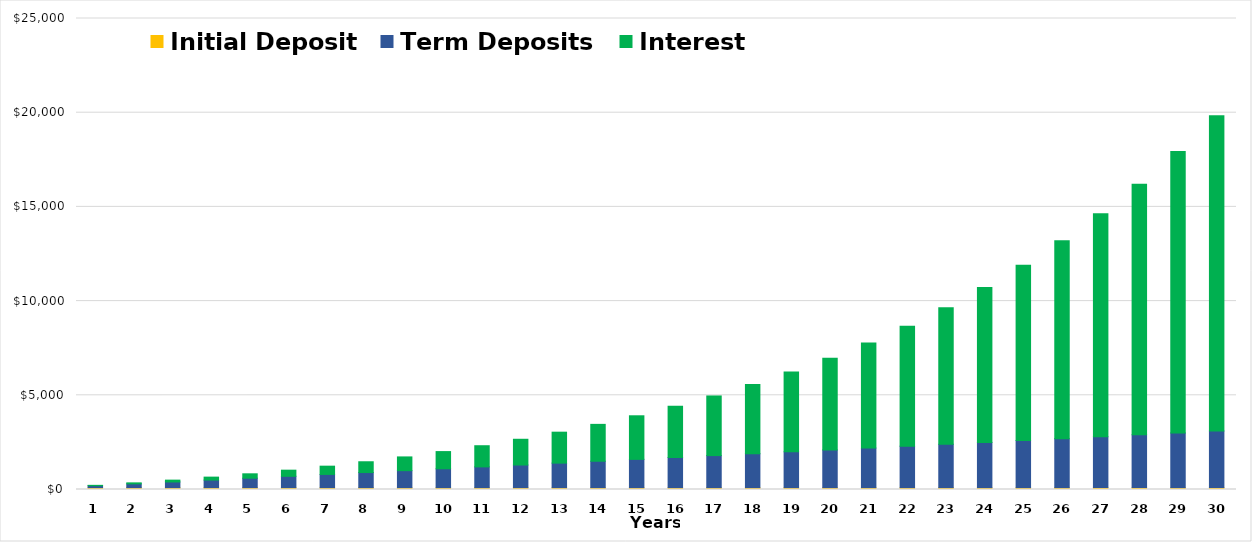
| Category | Initial Deposit | Term Deposits | Interest |
|---|---|---|---|
| 0 | 100 | 100 | 20 |
| 1 | 100 | 200 | 52 |
| 2 | 100 | 300 | 97.2 |
| 3 | 100 | 400 | 156.92 |
| 4 | 100 | 500 | 232.612 |
| 5 | 100 | 600 | 325.873 |
| 6 | 100 | 700 | 438.461 |
| 7 | 100 | 800 | 572.307 |
| 8 | 100 | 900 | 729.537 |
| 9 | 100 | 1000 | 912.491 |
| 10 | 100 | 1100 | 1123.74 |
| 11 | 100 | 1200 | 1366.114 |
| 12 | 100 | 1300 | 1642.725 |
| 13 | 100 | 1400 | 1956.998 |
| 14 | 100 | 1500 | 2312.698 |
| 15 | 100 | 1600 | 2713.968 |
| 16 | 100 | 1700 | 3165.364 |
| 17 | 100 | 1800 | 3671.901 |
| 18 | 100 | 1900 | 4239.091 |
| 19 | 100 | 2000 | 4873 |
| 20 | 100 | 2100 | 5580.3 |
| 21 | 100 | 2200 | 6368.33 |
| 22 | 100 | 2300 | 7245.163 |
| 23 | 100 | 2400 | 8219.679 |
| 24 | 100 | 2500 | 9301.647 |
| 25 | 100 | 2600 | 10501.812 |
| 26 | 100 | 2700 | 11831.993 |
| 27 | 100 | 2800 | 13305.192 |
| 28 | 100 | 2900 | 14935.712 |
| 29 | 100 | 3000 | 16739.283 |